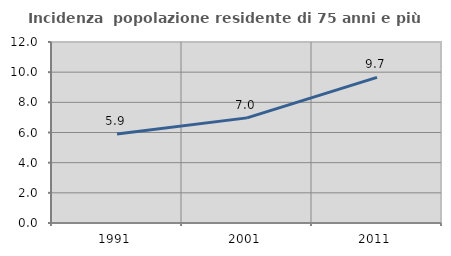
| Category | Incidenza  popolazione residente di 75 anni e più |
|---|---|
| 1991.0 | 5.906 |
| 2001.0 | 6.97 |
| 2011.0 | 9.652 |